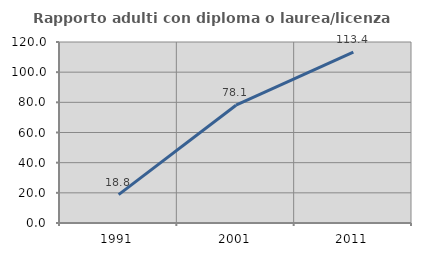
| Category | Rapporto adulti con diploma o laurea/licenza media  |
|---|---|
| 1991.0 | 18.839 |
| 2001.0 | 78.098 |
| 2011.0 | 113.354 |